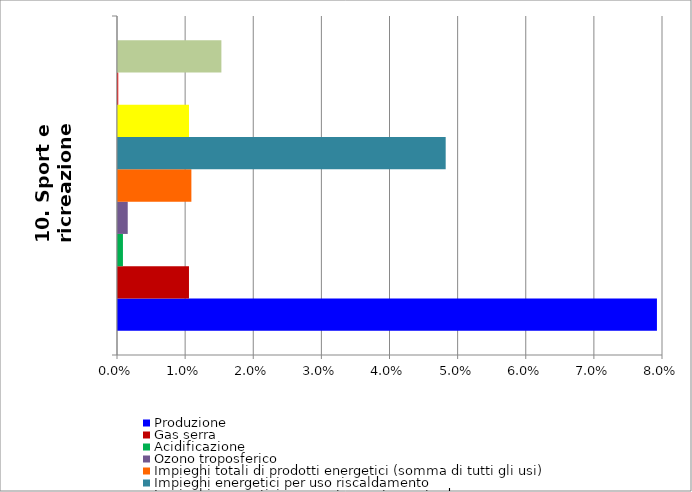
| Category | Produzione | Gas serra | Acidificazione | Ozono troposferico | Impieghi totali di prodotti energetici (somma di tutti gli usi) | Impieghi energetici per uso riscaldamento | Impieghi energetici per uso trasporto su strada | Impieghi energetici per uso trasporto 'off road' | Impieghi di elettricità |
|---|---|---|---|---|---|---|---|---|---|
| 10. Sport e ricreazione | 0.079 | 0.01 | 0.001 | 0.001 | 0.011 | 0.048 | 0.01 | 0 | 0.015 |